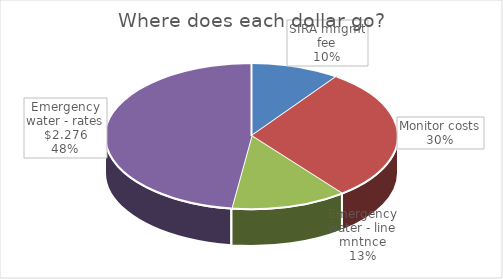
| Category | Series 0 |
|---|---|
| SIRA mngmt fee | 5848.8 |
| Monitor costs | 17501.59 |
| Emergency water - line mntnce | 7564.63 |
| Emergency water - rates $2.276 | 28330.88 |